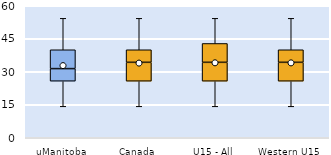
| Category | 25th | 50th | 75th |
|---|---|---|---|
| uManitoba | 25.714 | 5.714 | 8.571 |
| Canada | 25.714 | 8.571 | 5.714 |
| U15 - All | 25.714 | 8.571 | 8.571 |
| Western U15 | 25.714 | 8.571 | 5.714 |